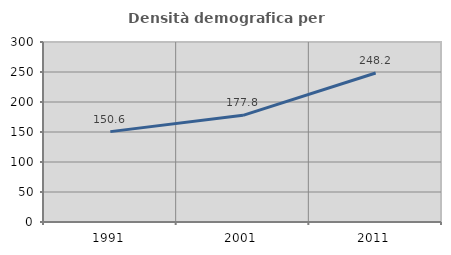
| Category | Densità demografica |
|---|---|
| 1991.0 | 150.639 |
| 2001.0 | 177.816 |
| 2011.0 | 248.247 |